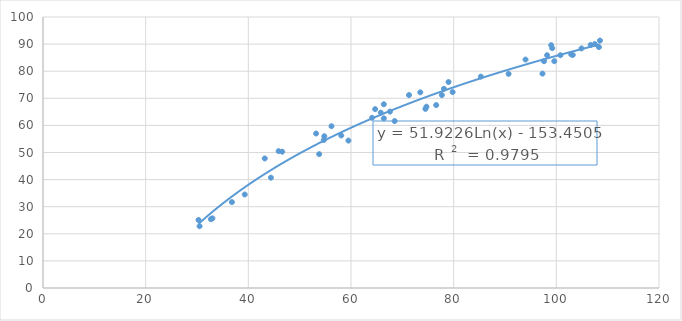
| Category | Series 0 |
|---|---|
| 66.4 | 67.8 |
| 53.2 | 57 |
| 90.7 | 79 |
| 108.5 | 91.3 |
| 30.3 | 25.1 |
| 64.1 | 62.8 |
| 71.3 | 71.2 |
| 33.0 | 25.7 |
| 65.8 | 64.7 |
| 85.3 | 78 |
| 107.5 | 90 |
| 74.7 | 66.9 |
| 74.5 | 66.1 |
| 97.3 | 79.1 |
| 76.6 | 67.5 |
| 94.0 | 84.3 |
| 104.9 | 88.4 |
| 97.6 | 83.7 |
| 99.0 | 89.6 |
| 32.7 | 25.4 |
| 44.4 | 40.7 |
| 56.2 | 59.7 |
| 77.7 | 71.2 |
| 54.8 | 56 |
| 106.7 | 89.7 |
| 73.5 | 72.2 |
| 53.8 | 49.4 |
| 66.4 | 62.6 |
| 98.2 | 85.9 |
| 58.1 | 56.3 |
| 36.8 | 31.7 |
| 43.2 | 47.8 |
| 64.7 | 66 |
| 79.8 | 72.3 |
| 100.8 | 85.9 |
| 59.5 | 54.4 |
| 103.2 | 86 |
| 30.5 | 22.8 |
| 99.6 | 83.7 |
| 79.0 | 76 |
| 45.9 | 50.5 |
| 68.5 | 61.6 |
| 102.9 | 86.2 |
| 78.1 | 73.5 |
| 67.6 | 65.1 |
| 99.2 | 88.5 |
| 39.3 | 34.5 |
| 54.7 | 54.6 |
| 108.3 | 88.9 |
| 46.6 | 50.3 |